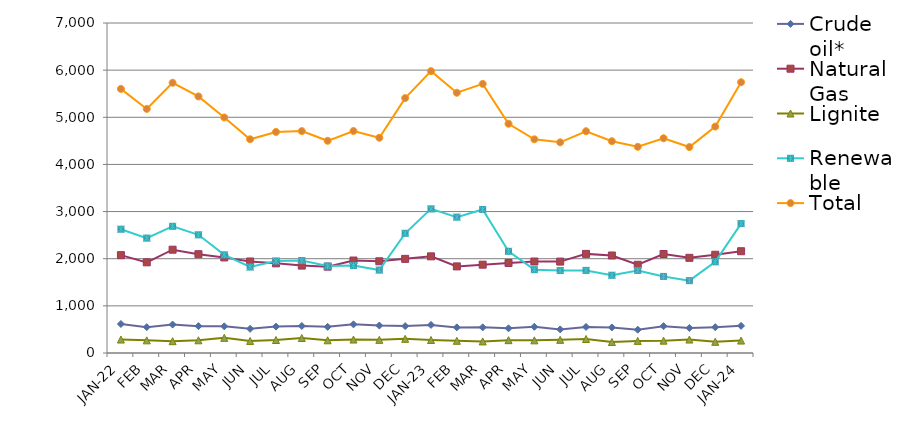
| Category | Crude oil* | Natural Gas | Lignite | Renewable | Total |
|---|---|---|---|---|---|
| JAN-22 | 615.22 | 2075.581 | 285.466 | 2625.93 | 5602.197 |
| FEB | 548.709 | 1923.055 | 268.76 | 2436.84 | 5177.364 |
| MAR | 602.636 | 2191.149 | 250.556 | 2686.93 | 5731.271 |
| APR | 569.613 | 2095.9 | 269.716 | 2506.9 | 5442.129 |
| MAY | 566.052 | 2027.253 | 321.338 | 2081.93 | 4996.573 |
| JUN | 512.473 | 1941.278 | 255.9 | 1823.9 | 4533.551 |
| JUL | 559.849 | 1901.744 | 275.488 | 1951.93 | 4689.012 |
| AUG | 573.58 | 1854.011 | 317.401 | 1961.93 | 4706.923 |
| SEP | 554.735 | 1831.648 | 269.711 | 1844.9 | 4500.994 |
| OCT | 607.579 | 1961.43 | 285.05 | 1854.93 | 4708.989 |
| NOV | 582.233 | 1945.369 | 279.099 | 1758.9 | 4565.601 |
| DEC | 570.234 | 1996.901 | 300.462 | 2538.93 | 5406.527 |
| JAN-23 | 595.562 | 2050.073 | 276.483 | 3056.93 | 5979.047 |
| FEB | 543.347 | 1836.922 | 258.545 | 2881.84 | 5520.654 |
| MAR | 544.138 | 1873.48 | 245.758 | 3044.93 | 5708.305 |
| APR | 523.544 | 1909.944 | 272.275 | 2156.9 | 4862.664 |
| MAY | 555.528 | 1940.819 | 268.537 | 1767.92 | 4532.804 |
| JUN | 500.728 | 1939.074 | 279.286 | 1749.89 | 4468.978 |
| JUL | 552.562 | 2102.521 | 297.24 | 1751.82 | 4704.143 |
| AUG | 541.98 | 2068.423 | 233.345 | 1649 | 4492.748 |
| SEP | 493.796 | 1871.622 | 257.035 | 1751 | 4373.453 |
| OCT | 568.929 | 2099.825 | 262.217 | 1624 | 4554.971 |
| NOV | 530.557 | 2018.486 | 285.229 | 1534.74 | 4369.011 |
| DEC | 547.269 | 2083.579 | 237.306 | 1934.67 | 4802.824 |
| JAN-24 | 575.65 | 2158.954 | 263.844 | 2744.93 | 5743.377 |